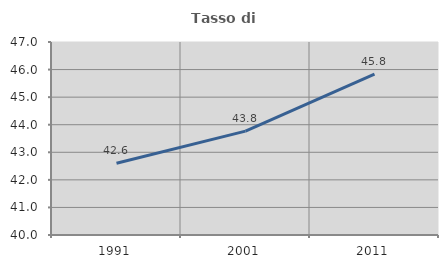
| Category | Tasso di occupazione   |
|---|---|
| 1991.0 | 42.601 |
| 2001.0 | 43.769 |
| 2011.0 | 45.833 |